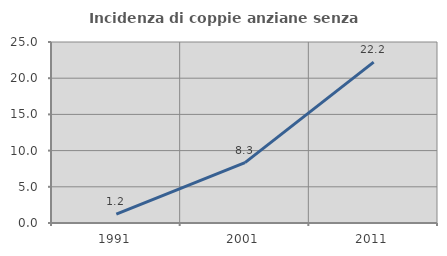
| Category | Incidenza di coppie anziane senza figli  |
|---|---|
| 1991.0 | 1.22 |
| 2001.0 | 8.333 |
| 2011.0 | 22.222 |